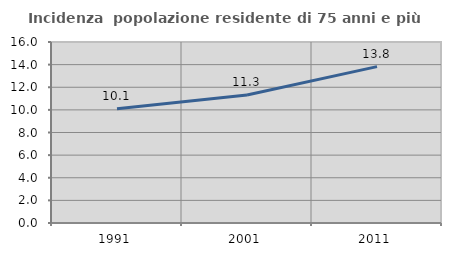
| Category | Incidenza  popolazione residente di 75 anni e più |
|---|---|
| 1991.0 | 10.096 |
| 2001.0 | 11.317 |
| 2011.0 | 13.823 |